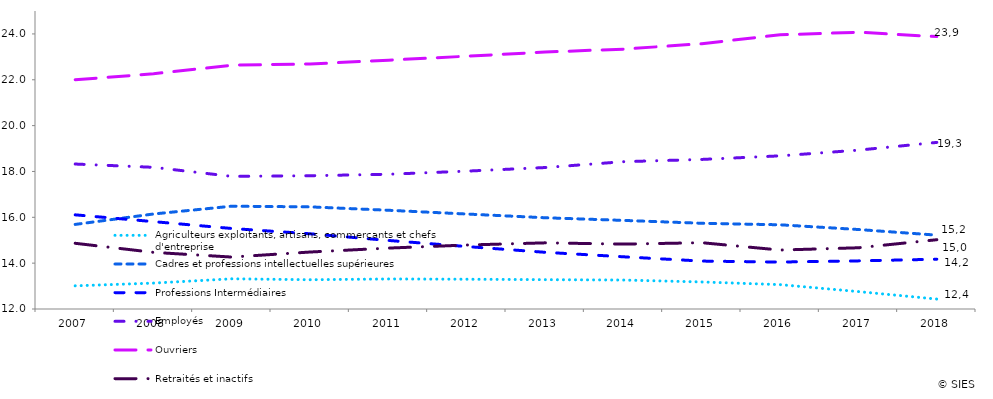
| Category | Agriculteurs exploitants, artisans, commerçants et chefs d'entreprise | Cadres et professions intellectuelles supérieures | Professions Intermédiaires | Employés | Ouvriers | Retraités et inactifs |
|---|---|---|---|---|---|---|
| 2007.0 | 13.011 | 15.69 | 16.108 | 18.324 | 22.001 | 14.867 |
| 2008.0 | 13.13 | 16.145 | 15.812 | 18.181 | 22.262 | 14.471 |
| 2009.0 | 13.317 | 16.485 | 15.512 | 17.786 | 22.635 | 14.265 |
| 2010.0 | 13.277 | 16.455 | 15.281 | 17.814 | 22.688 | 14.486 |
| 2011.0 | 13.31 | 16.307 | 14.99 | 17.878 | 22.856 | 14.658 |
| 2012.0 | 13.299 | 16.143 | 14.724 | 18.015 | 23.028 | 14.791 |
| 2013.0 | 13.28 | 15.981 | 14.473 | 18.171 | 23.209 | 14.886 |
| 2014.0 | 13.264 | 15.865 | 14.277 | 18.427 | 23.337 | 14.83 |
| 2015.0 | 13.18 | 15.74 | 14.09 | 18.525 | 23.573 | 14.892 |
| 2016.0 | 13.063 | 15.674 | 14.048 | 18.681 | 23.963 | 14.572 |
| 2017.0 | 12.758 | 15.467 | 14.099 | 18.931 | 24.074 | 14.671 |
| 2018.0 | 12.434 | 15.222 | 14.172 | 19.268 | 23.882 | 15.023 |